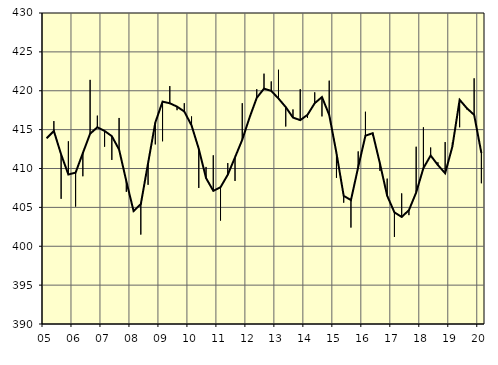
| Category | Trend | Originalvärden |
|---|---|---|
| 5.0 | 413.89 | 413.9 |
| nan | 414.82 | 416.1 |
| 6.0 | 411.81 | 406.1 |
| 6.0 | 409.23 | 413.5 |
| 6.0 | 409.47 | 405.1 |
| nan | 411.99 | 409 |
| 7.0 | 414.47 | 421.4 |
| 7.0 | 415.3 | 416.8 |
| 7.0 | 414.83 | 412.8 |
| nan | 414.16 | 411.1 |
| 8.0 | 412.44 | 416.5 |
| 8.0 | 408.37 | 407 |
| 8.0 | 404.53 | 404.4 |
| nan | 405.42 | 401.5 |
| 9.0 | 410.68 | 407.9 |
| 9.0 | 415.91 | 413.1 |
| 9.0 | 418.6 | 413.5 |
| nan | 418.39 | 420.6 |
| 10.0 | 417.96 | 417.5 |
| 10.0 | 417.33 | 418.4 |
| 10.0 | 415.54 | 416.7 |
| nan | 412.52 | 407.5 |
| 11.0 | 408.77 | 410.2 |
| 11.0 | 407.13 | 411.7 |
| 11.0 | 407.59 | 403.3 |
| nan | 409.2 | 410.7 |
| 12.0 | 411.44 | 408.4 |
| 12.0 | 413.7 | 418.4 |
| 12.0 | 416.54 | 416.5 |
| nan | 419.09 | 420.2 |
| 13.0 | 420.27 | 422.2 |
| 13.0 | 419.98 | 421.2 |
| 13.0 | 419 | 422.7 |
| nan | 417.9 | 415.4 |
| 14.0 | 416.55 | 417.6 |
| 14.0 | 416.22 | 420.2 |
| 14.0 | 416.9 | 416.5 |
| nan | 418.4 | 419.8 |
| 15.0 | 419.19 | 416.7 |
| 15.0 | 416.89 | 421.3 |
| 15.0 | 411.99 | 408.8 |
| nan | 406.48 | 405.6 |
| 16.0 | 405.94 | 402.4 |
| 16.0 | 410.18 | 412.2 |
| 16.0 | 414.22 | 417.3 |
| nan | 414.54 | 414.2 |
| 17.0 | 410.64 | 409.7 |
| 17.0 | 406.49 | 408.7 |
| 17.0 | 404.36 | 401.2 |
| nan | 403.77 | 406.8 |
| 18.0 | 404.64 | 404 |
| 18.0 | 406.91 | 412.8 |
| 18.0 | 410.05 | 415.3 |
| nan | 411.67 | 412.7 |
| 19.0 | 410.44 | 410.8 |
| 19.0 | 409.39 | 413.4 |
| 19.0 | 412.83 | 413.4 |
| nan | 418.84 | 415.3 |
| 20.0 | 417.75 | 417.6 |
| 20.0 | 416.9 | 421.6 |
| 20.0 | 411.99 | 408.1 |